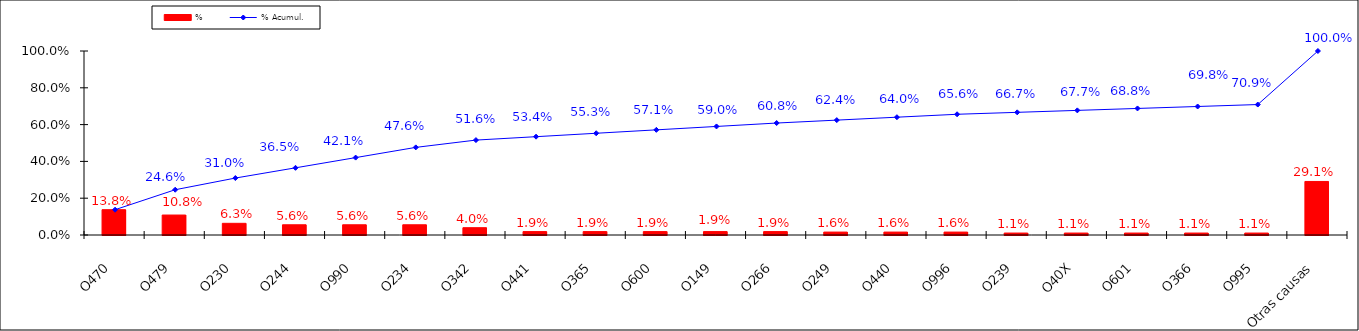
| Category | % |
|---|---|
| O470 | 0.138 |
| O479 | 0.108 |
| O230 | 0.063 |
| O244 | 0.056 |
| O990 | 0.056 |
| O234 | 0.056 |
| O342 | 0.04 |
| O441 | 0.019 |
| O365 | 0.019 |
| O600 | 0.019 |
| O149 | 0.019 |
| O266 | 0.019 |
| O249 | 0.016 |
| O440 | 0.016 |
| O996 | 0.016 |
| O239 | 0.011 |
| O40X | 0.011 |
| O601 | 0.011 |
| O366 | 0.011 |
| O995 | 0.011 |
| Otras causas | 0.291 |